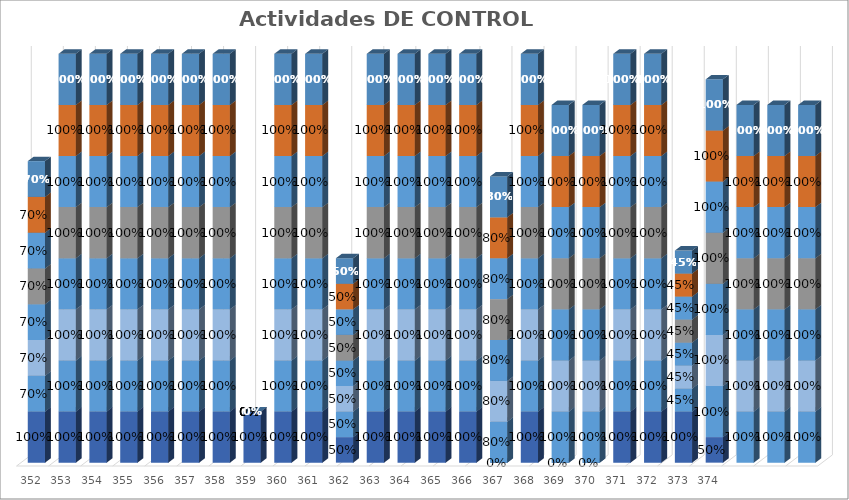
| Category | % Avance |
|---|---|
| 352.0 | 0.7 |
| 353.0 | 1 |
| 354.0 | 1 |
| 355.0 | 1 |
| 356.0 | 1 |
| 357.0 | 1 |
| 358.0 | 1 |
| 359.0 | 0 |
| 360.0 | 1 |
| 361.0 | 1 |
| 362.0 | 0.5 |
| 363.0 | 1 |
| 364.0 | 1 |
| 365.0 | 1 |
| 366.0 | 1 |
| 367.0 | 0.8 |
| 368.0 | 1 |
| 369.0 | 1 |
| 370.0 | 1 |
| 371.0 | 1 |
| 372.0 | 1 |
| 373.0 | 0.45 |
| 374.0 | 1 |